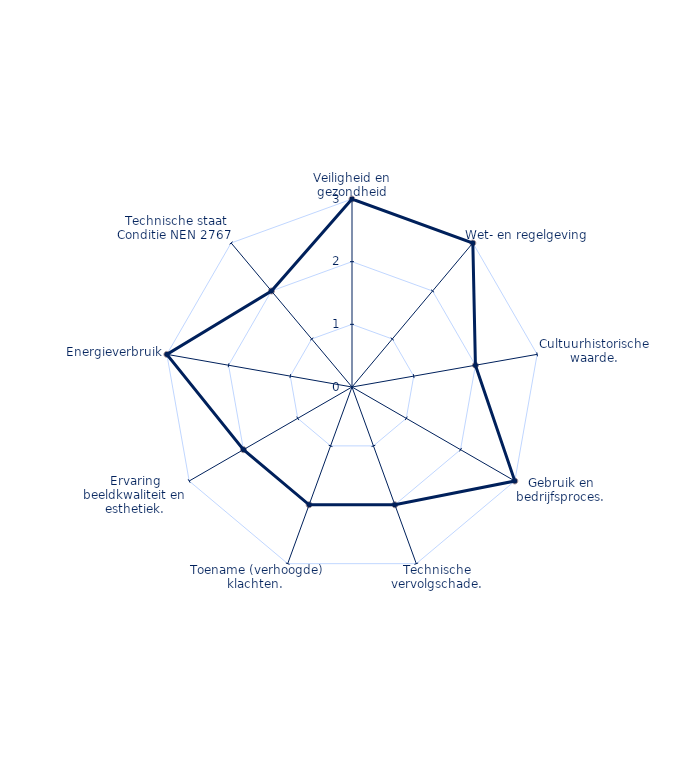
| Category | Series 0 |
|---|---|
| Veiligheid en gezondheid | 3 |
| Wet- en regelgeving | 3 |
| Cultuurhistorische waarde. | 2 |
| Gebruik en bedrijfsproces. | 3 |
| Technische vervolgschade. | 2 |
| Toename (verhoogde) klachten.  | 2 |
| Ervaring beeldkwaliteit en esthetiek. | 2 |
| Energieverbruik | 3 |
| Technische staat Conditie NEN 2767  | 2 |